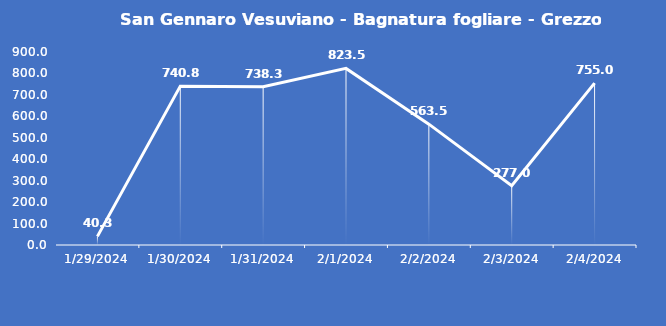
| Category | San Gennaro Vesuviano - Bagnatura fogliare - Grezzo (min) |
|---|---|
| 1/29/24 | 40.3 |
| 1/30/24 | 740.8 |
| 1/31/24 | 738.3 |
| 2/1/24 | 823.5 |
| 2/2/24 | 563.5 |
| 2/3/24 | 277 |
| 2/4/24 | 755 |